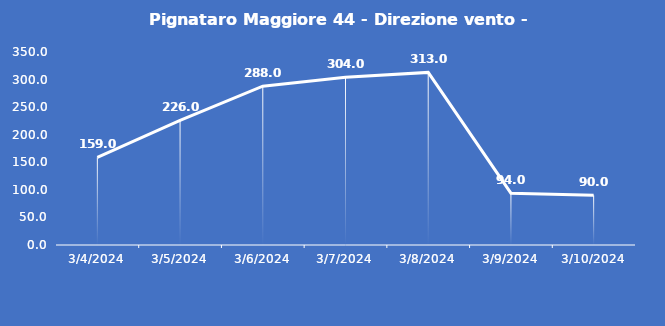
| Category | Pignataro Maggiore 44 - Direzione vento - Grezzo (°N) |
|---|---|
| 3/4/24 | 159 |
| 3/5/24 | 226 |
| 3/6/24 | 288 |
| 3/7/24 | 304 |
| 3/8/24 | 313 |
| 3/9/24 | 94 |
| 3/10/24 | 90 |